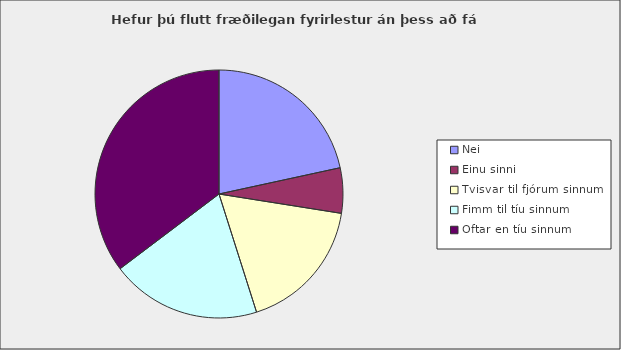
| Category | Series 0 |
|---|---|
| Nei | 0.216 |
| Einu sinni | 0.059 |
| Tvisvar til fjórum sinnum | 0.176 |
| Fimm til tíu sinnum | 0.196 |
| Oftar en tíu sinnum | 0.353 |